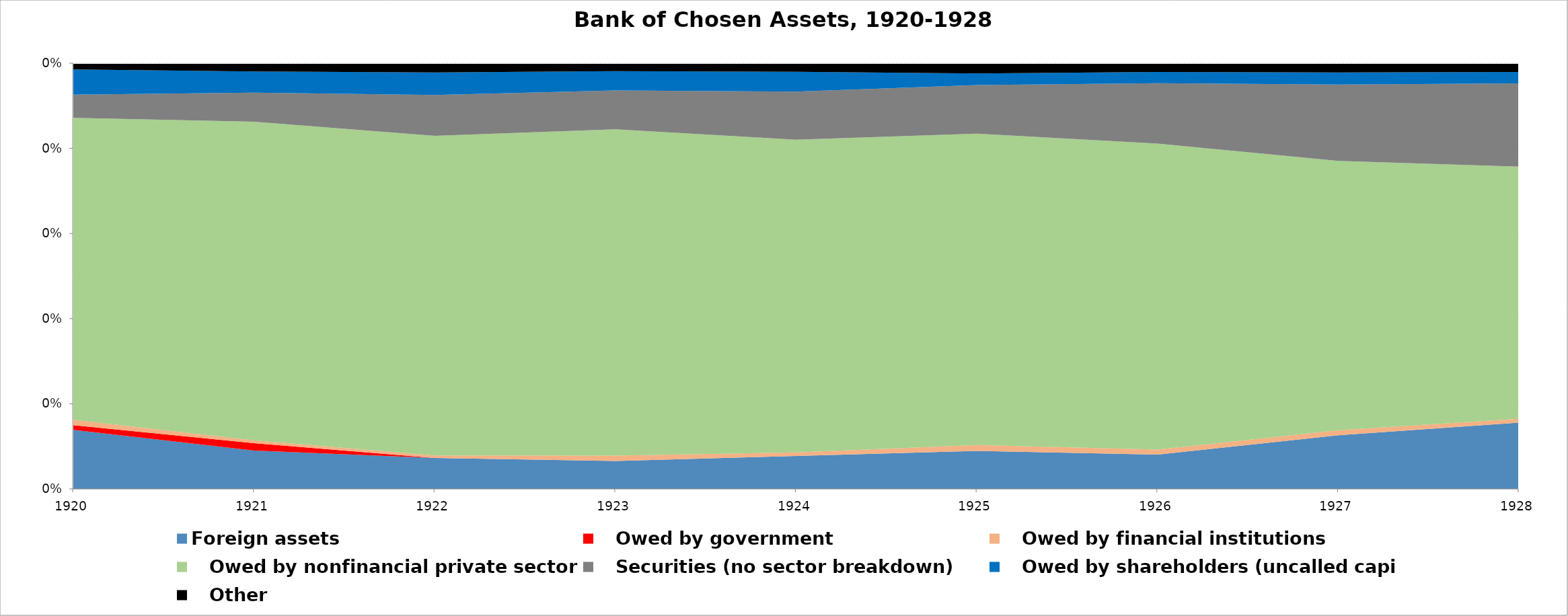
| Category | Foreign assets |    Owed by government |    Owed by financial institutions |    Owed by nonfinancial private sector |    Securities (no sector breakdown) |    Owed by shareholders (uncalled capital) |    Other |
|---|---|---|---|---|---|---|---|
| 1920.0 | 70310301 | 5500000 | 6526042 | 359671481 | 27579556 | 30000000 | 7450770 |
| 1921.0 | 54124786 | 10500000 | 3872434 | 449753711 | 40914198 | 30000000 | 11536616 |
| 1922.0 | 40963795 | 0 | 3342962 | 424218018 | 54275709 | 30000000 | 12200986 |
| 1923.0 | 43289004 | 0 | 8428272 | 505982019 | 60154873 | 30000000 | 12352910 |
| 1924.0 | 49827456 | 0 | 5448573 | 473264600 | 72647873 | 30000000 | 13037021 |
| 1925.0 | 48804594 | 0 | 7518431 | 400260612 | 62345315 | 15000000 | 13079559 |
| 1926.0 | 45052000 | 0 | 6847228 | 402856133 | 79312287 | 15000000 | 11443441 |
| 1927.0 | 66468302 | 0 | 6286047 | 333658156 | 94537265 | 15000000 | 11446176 |
| 1928.0 | 87193657 | 0 | 5097741 | 331673477 | 109534050 | 15000000 | 11440286 |